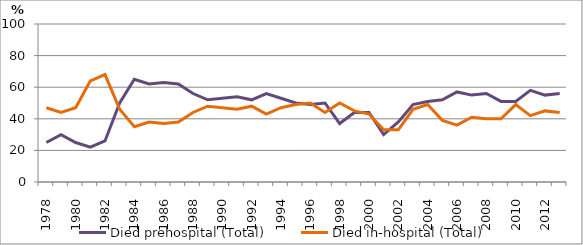
| Category | Died prehospital (Total) | Died in-hospital (Total) |
|---|---|---|
| 1978.0 | 25 | 47 |
| 1979.0 | 30 | 44 |
| 1980.0 | 25 | 47 |
| 1981.0 | 22 | 64 |
| 1982.0 | 26 | 68 |
| 1983.0 | 50 | 46 |
| 1984.0 | 65 | 35 |
| 1985.0 | 62 | 38 |
| 1986.0 | 63 | 37 |
| 1987.0 | 62 | 38 |
| 1988.0 | 56 | 44 |
| 1989.0 | 52 | 48 |
| 1990.0 | 53 | 47 |
| 1991.0 | 54 | 46 |
| 1992.0 | 52 | 48 |
| 1993.0 | 56 | 43 |
| 1994.0 | 53 | 47 |
| 1995.0 | 50 | 49 |
| 1996.0 | 49 | 50 |
| 1997.0 | 50 | 44 |
| 1998.0 | 37 | 50 |
| 1999.0 | 44 | 45 |
| 2000.0 | 44 | 43 |
| 2001.0 | 30 | 33 |
| 2002.0 | 38 | 33 |
| 2003.0 | 49 | 46 |
| 2004.0 | 51 | 49 |
| 2005.0 | 52 | 39 |
| 2006.0 | 57 | 36 |
| 2007.0 | 55 | 41 |
| 2008.0 | 56 | 40 |
| 2009.0 | 51 | 40 |
| 2010.0 | 51 | 49 |
| 2011.0 | 58 | 42 |
| 2012.0 | 55 | 45 |
| 2013.0 | 56 | 44 |